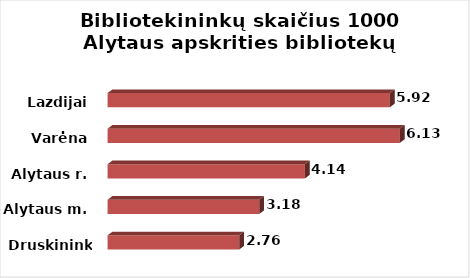
| Category | Series 0 |
|---|---|
| Druskininkai | 2.76 |
| Alytaus m. | 3.18 |
| Alytaus r. | 4.14 |
| Varėna | 6.13 |
| Lazdijai | 5.92 |